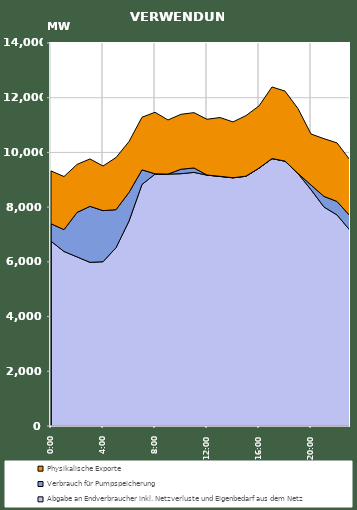
| Category | Abgabe an Endverbraucher inkl. Netzverluste und Eigenbedarf aus dem Netz | Verbrauch für Pumpspeicherung | Physikalische Exporte |
|---|---|---|---|
| 2007-01-17 | 6754.41 | 638.583 | 1931.526 |
| 2007-01-17 01:00:00 | 6379.235 | 798.275 | 1940.96 |
| 2007-01-17 02:00:00 | 6181.352 | 1625.06 | 1755.1 |
| 2007-01-17 03:00:00 | 5982.317 | 2046.587 | 1733.476 |
| 2007-01-17 04:00:00 | 6005.012 | 1867.716 | 1631.119 |
| 2007-01-17 05:00:00 | 6515.821 | 1390.931 | 1905.881 |
| 2007-01-17 06:00:00 | 7490.926 | 1048.186 | 1858.176 |
| 2007-01-17 07:00:00 | 8830.112 | 532.207 | 1923.763 |
| 2007-01-17 08:00:00 | 9204.654 | 14.063 | 2249.315 |
| 2007-01-17 09:00:00 | 9207.886 | 2.19 | 1976.744 |
| 2007-01-17 10:00:00 | 9222.509 | 162.893 | 2008.309 |
| 2007-01-17 11:00:00 | 9269.405 | 162.995 | 2022.342 |
| 2007-01-17 12:00:00 | 9170.172 | 3.255 | 2039.077 |
| 2007-01-17 13:00:00 | 9122.156 | 4.901 | 2148.048 |
| 2007-01-17 14:00:00 | 9071.438 | 3.29 | 2040.717 |
| 2007-01-17 15:00:00 | 9129.294 | 3.901 | 2213.148 |
| 2007-01-17 16:00:00 | 9424.466 | 3.079 | 2272.126 |
| 2007-01-17 17:00:00 | 9773.238 | 3.629 | 2616.36 |
| 2007-01-17 18:00:00 | 9680.363 | 2.816 | 2559.367 |
| 2007-01-17 19:00:00 | 9228.362 | 2.792 | 2369.849 |
| 2007-01-17 20:00:00 | 8637.712 | 170.224 | 1866.187 |
| 2007-01-17 21:00:00 | 8004.193 | 387.539 | 2110.255 |
| 2007-01-17 22:00:00 | 7714.514 | 493.54 | 2141.373 |
| 2007-01-17 23:00:00 | 7153.203 | 528.506 | 2042.391 |